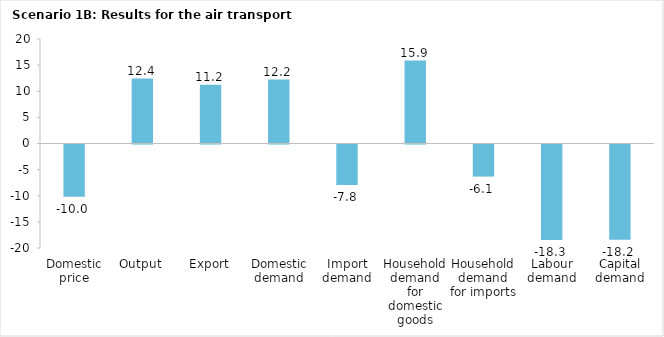
| Category | Series 0 |
|---|---|
| Domestic price | -10 |
| Output | 12.428 |
| Export | 11.228 |
| Domestic demand | 12.226 |
| Import demand | -7.763 |
| Household demand for domestic goods | 15.874 |
| Household demand for imports | -6.142 |
| Labour demand | -18.258 |
| Capital demand | -18.227 |